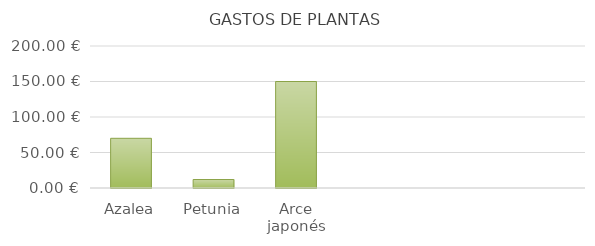
| Category | Azalea |
|---|---|
| Azalea | 70 |
| Petunia | 11.94 |
| Arce japonés | 150 |